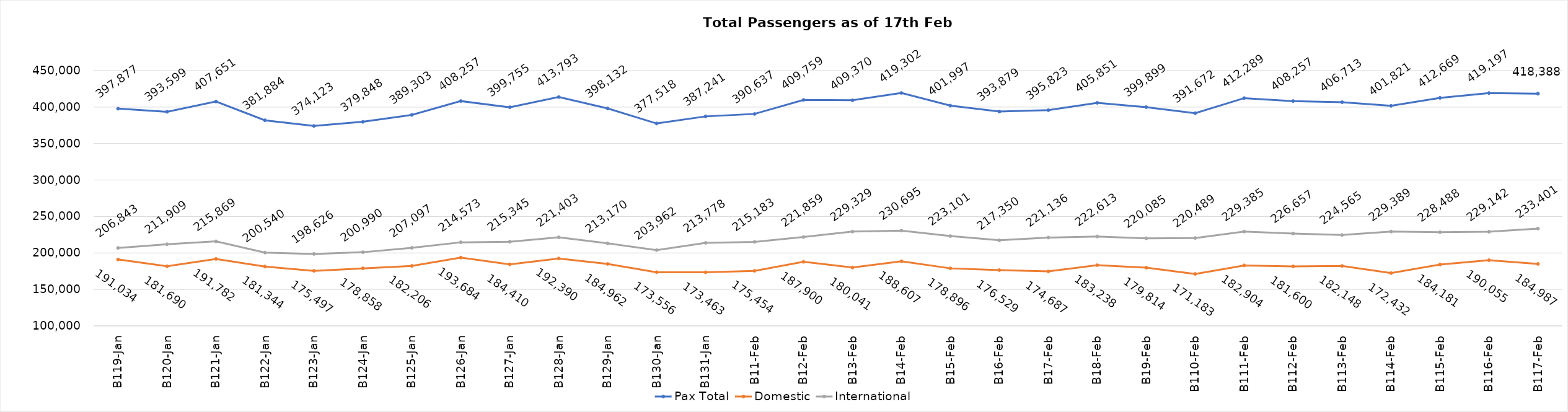
| Category | Pax Total | Domestic | International |
|---|---|---|---|
| 2024-01-19 | 397877 | 191034 | 206843 |
| 2024-01-20 | 393599 | 181690 | 211909 |
| 2024-01-21 | 407651 | 191782 | 215869 |
| 2024-01-22 | 381884 | 181344 | 200540 |
| 2024-01-23 | 374123 | 175497 | 198626 |
| 2024-01-24 | 379848 | 178858 | 200990 |
| 2024-01-25 | 389303 | 182206 | 207097 |
| 2024-01-26 | 408257 | 193684 | 214573 |
| 2024-01-27 | 399755 | 184410 | 215345 |
| 2024-01-28 | 413793 | 192390 | 221403 |
| 2024-01-29 | 398132 | 184962 | 213170 |
| 2024-01-30 | 377518 | 173556 | 203962 |
| 2024-01-31 | 387241 | 173463 | 213778 |
| 2024-02-01 | 390637 | 175454 | 215183 |
| 2024-02-02 | 409759 | 187900 | 221859 |
| 2024-02-03 | 409370 | 180041 | 229329 |
| 2024-02-04 | 419302 | 188607 | 230695 |
| 2024-02-05 | 401997 | 178896 | 223101 |
| 2024-02-06 | 393879 | 176529 | 217350 |
| 2024-02-07 | 395823 | 174687 | 221136 |
| 2024-02-08 | 405851 | 183238 | 222613 |
| 2024-02-09 | 399899 | 179814 | 220085 |
| 2024-02-10 | 391672 | 171183 | 220489 |
| 2024-02-11 | 412289 | 182904 | 229385 |
| 2024-02-12 | 408257 | 181600 | 226657 |
| 2024-02-13 | 406713 | 182148 | 224565 |
| 2024-02-14 | 401821 | 172432 | 229389 |
| 2024-02-15 | 412669 | 184181 | 228488 |
| 2024-02-16 | 419197 | 190055 | 229142 |
| 2024-02-17 | 418388 | 184987 | 233401 |